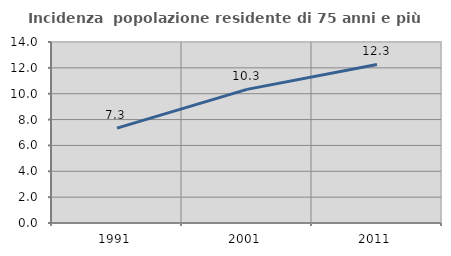
| Category | Incidenza  popolazione residente di 75 anni e più |
|---|---|
| 1991.0 | 7.334 |
| 2001.0 | 10.338 |
| 2011.0 | 12.261 |